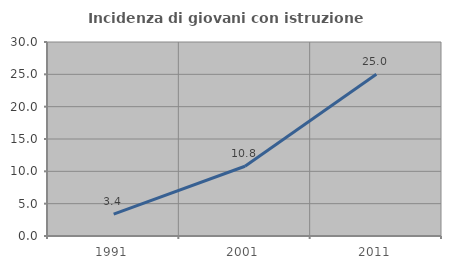
| Category | Incidenza di giovani con istruzione universitaria |
|---|---|
| 1991.0 | 3.378 |
| 2001.0 | 10.784 |
| 2011.0 | 25 |